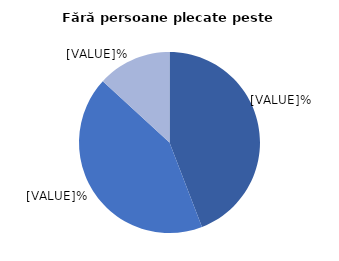
| Category | Fără persoane plecate peste hotare |
|---|---|
| 0 | 44.2 |
| 1 | 42.7 |
| 2 | 13.2 |